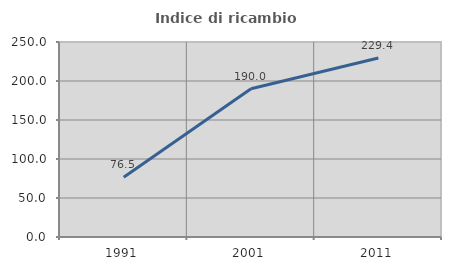
| Category | Indice di ricambio occupazionale  |
|---|---|
| 1991.0 | 76.471 |
| 2001.0 | 190 |
| 2011.0 | 229.412 |